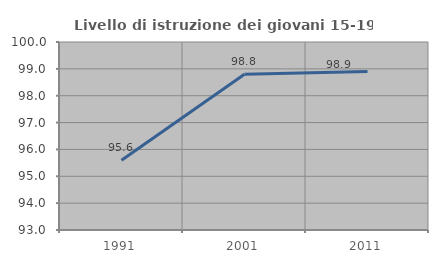
| Category | Livello di istruzione dei giovani 15-19 anni |
|---|---|
| 1991.0 | 95.596 |
| 2001.0 | 98.802 |
| 2011.0 | 98.898 |